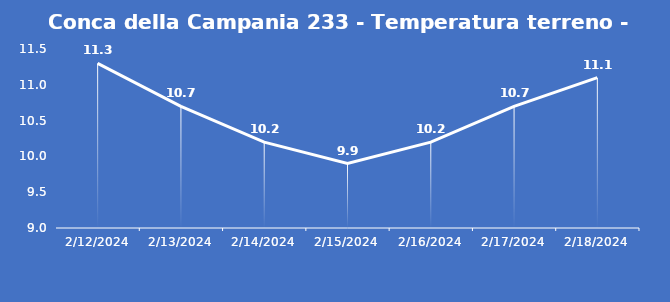
| Category | Conca della Campania 233 - Temperatura terreno - Grezzo (°C) |
|---|---|
| 2/12/24 | 11.3 |
| 2/13/24 | 10.7 |
| 2/14/24 | 10.2 |
| 2/15/24 | 9.9 |
| 2/16/24 | 10.2 |
| 2/17/24 | 10.7 |
| 2/18/24 | 11.1 |